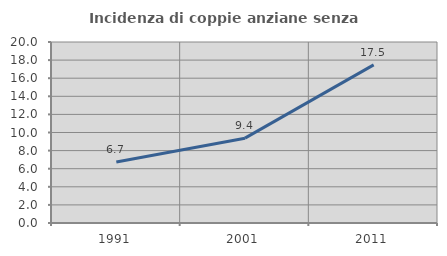
| Category | Incidenza di coppie anziane senza figli  |
|---|---|
| 1991.0 | 6.748 |
| 2001.0 | 9.375 |
| 2011.0 | 17.47 |